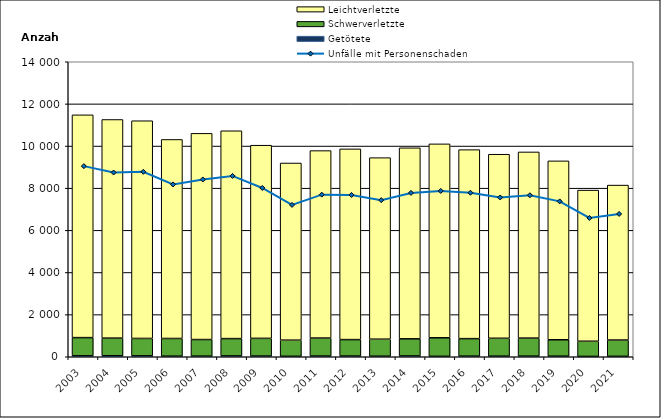
| Category | Getötete | Schwerverletzte | Leichtverletzte |
|---|---|---|---|
| 2003.0 | 44 | 864 | 10573 |
| 2004.0 | 48 | 836 | 10376 |
| 2005.0 | 43 | 826 | 10332 |
| 2006.0 | 28 | 839 | 9446 |
| 2007.0 | 30 | 787 | 9786 |
| 2008.0 | 40 | 821 | 9864 |
| 2009.0 | 33 | 840 | 9167 |
| 2010.0 | 22 | 765 | 8408 |
| 2011.0 | 34 | 853 | 8897 |
| 2012.0 | 33 | 781 | 9051 |
| 2013.0 | 26 | 808 | 8615 |
| 2014.0 | 38 | 812 | 9066 |
| 2015.0 | 20 | 880 | 9203 |
| 2016.0 | 29 | 831 | 8969 |
| 2017.0 | 28 | 849 | 8734 |
| 2018.0 | 29 | 856 | 8835 |
| 2019.0 | 28 | 778 | 8490 |
| 2020.0 | 15 | 721 | 7173 |
| 2021.0 | 20 | 773 | 7354 |